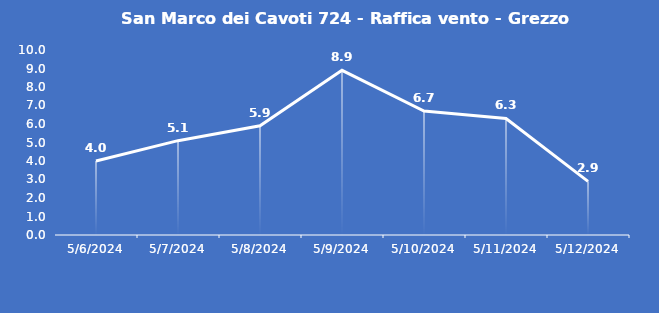
| Category | San Marco dei Cavoti 724 - Raffica vento - Grezzo (m/s) |
|---|---|
| 5/6/24 | 4 |
| 5/7/24 | 5.1 |
| 5/8/24 | 5.9 |
| 5/9/24 | 8.9 |
| 5/10/24 | 6.7 |
| 5/11/24 | 6.3 |
| 5/12/24 | 2.9 |